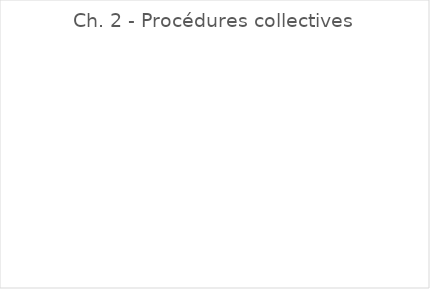
| Category | Ch. 2 - Procédures collectives |
|---|---|
| A. DAMERON | 0 |
| N. de SCHONEN | 0 |
| G. PLOCQ | 0 |
| J.-F. JAVIER | 0 |
| J. PARADIS | 0 |
| F. JACQUIER | 0 |
| Ph. BONDUELLE | 0 |
| P. DELABARRE | 0 |
| A. SCHEID | 0 |
| O. TASSAN | 0 |
| Ch. COTELLE | 0 |
| M. DAVID | 0 |
| D. DAEVIDIAK | 0 |